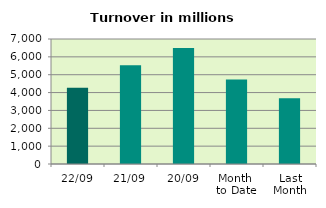
| Category | Series 0 |
|---|---|
| 22/09 | 4266.481 |
| 21/09 | 5529.36 |
| 20/09 | 6500.871 |
| Month 
to Date | 4736.862 |
| Last
Month | 3679.291 |